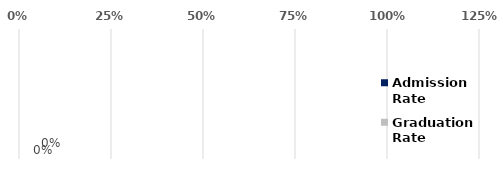
| Category | Admission
Rate | Graduation
Rate |
|---|---|---|
| Straight or Heterosexual | 0 | 0 |
| Bisexual | 0 | 0 |
| Gay or Lesbian | 0 | 0 |
| Unsure | 0 | 0 |
| Total | 0 | 0 |